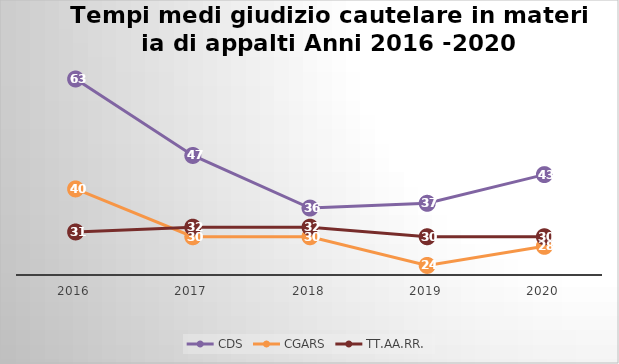
| Category | CDS | CGARS | TT.AA.RR. |
|---|---|---|---|
| 2016.0 | 63 | 40 | 31 |
| 2017.0 | 47 | 30 | 32 |
| 2018.0 | 36 | 30 | 32 |
| 2019.0 | 37 | 24 | 30 |
| 2020.0 | 43 | 28 | 30 |